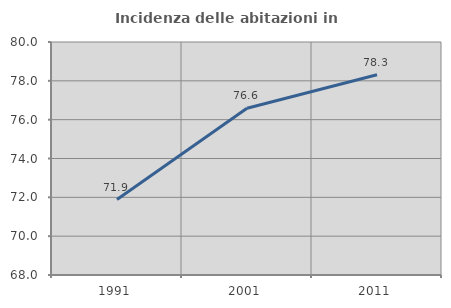
| Category | Incidenza delle abitazioni in proprietà  |
|---|---|
| 1991.0 | 71.885 |
| 2001.0 | 76.584 |
| 2011.0 | 78.316 |